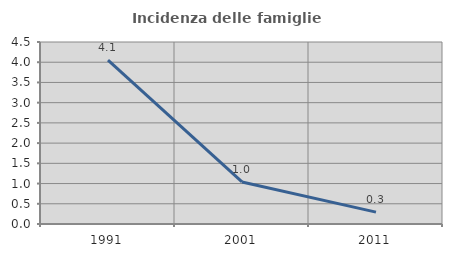
| Category | Incidenza delle famiglie numerose |
|---|---|
| 1991.0 | 4.053 |
| 2001.0 | 1.04 |
| 2011.0 | 0.293 |